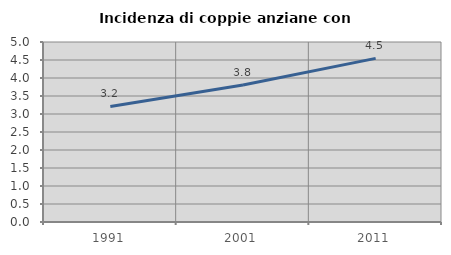
| Category | Incidenza di coppie anziane con figli |
|---|---|
| 1991.0 | 3.211 |
| 2001.0 | 3.804 |
| 2011.0 | 4.545 |